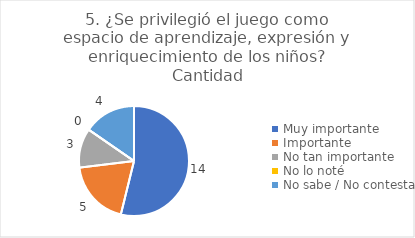
| Category | 5. ¿Se privilegió el juego como espacio de aprendizaje, expresión y enriquecimiento de los niños? |
|---|---|
| Muy importante  | 0.538 |
| Importante  | 0.192 |
| No tan importante  | 0.115 |
| No lo noté  | 0 |
| No sabe / No contesta | 0.154 |